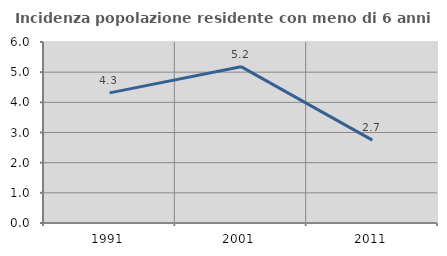
| Category | Incidenza popolazione residente con meno di 6 anni |
|---|---|
| 1991.0 | 4.314 |
| 2001.0 | 5.182 |
| 2011.0 | 2.747 |